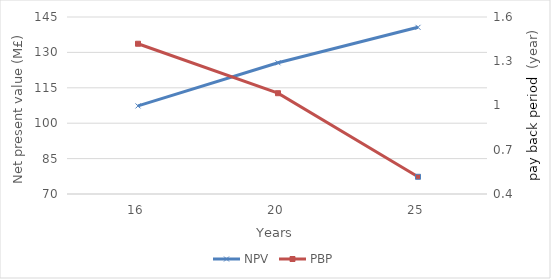
| Category | NPV |
|---|---|
| 16.0 | 107.325 |
| 20.0 | 125.597 |
| 25.0 | 140.63 |